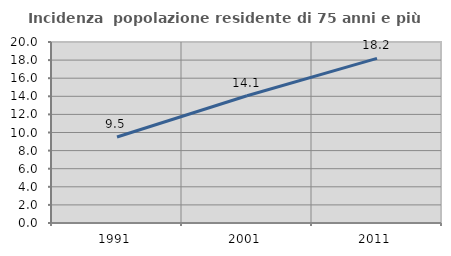
| Category | Incidenza  popolazione residente di 75 anni e più |
|---|---|
| 1991.0 | 9.503 |
| 2001.0 | 14.064 |
| 2011.0 | 18.191 |